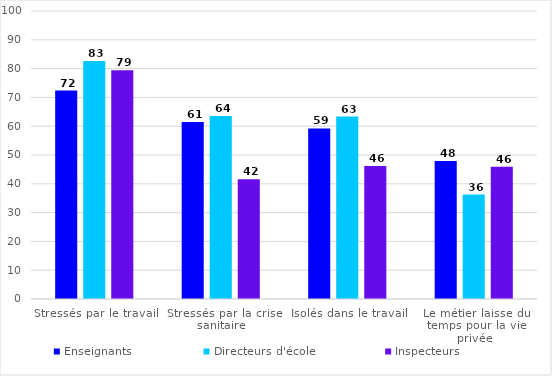
| Category | Enseignants | Directeurs d'école | Inspecteurs |
|---|---|---|---|
| Stressés par le travail | 72.371 | 82.663 | 79.452 |
| Stressés par la crise sanitaire | 61.461 | 63.532 | 41.582 |
| Isolés dans le travail | 59.205 | 63.326 | 46.201 |
| Le métier laisse du temps pour la vie privée | 47.885 | 36.244 | 45.928 |